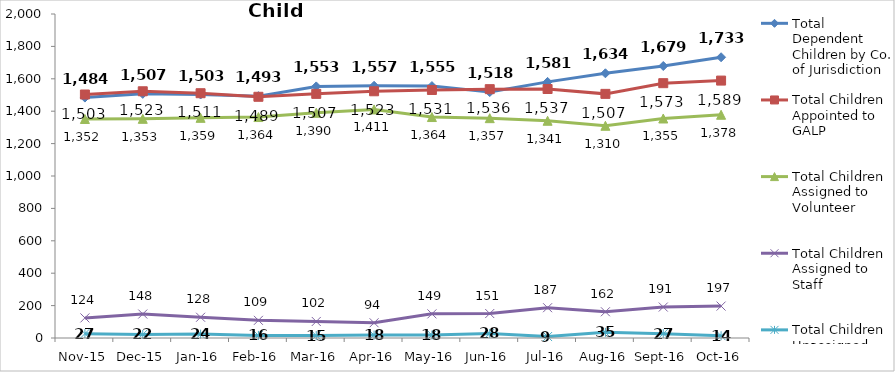
| Category | Total Dependent Children by Co. of Jurisdiction | Total Children Appointed to GALP | Total Children Assigned to Volunteer | Total Children Assigned to Staff | Total Children Unassigned |
|---|---|---|---|---|---|
| Nov-15 | 1484 | 1503 | 1352 | 124 | 27 |
| Dec-15 | 1507 | 1523 | 1353 | 148 | 22 |
| Jan-16 | 1503 | 1511 | 1359 | 128 | 24 |
| Feb-16 | 1493 | 1489 | 1364 | 109 | 16 |
| Mar-16 | 1553 | 1507 | 1390 | 102 | 15 |
| Apr-16 | 1557 | 1523 | 1411 | 94 | 18 |
| May-16 | 1555 | 1531 | 1364 | 149 | 18 |
| Jun-16 | 1518 | 1536 | 1357 | 151 | 28 |
| Jul-16 | 1581 | 1537 | 1341 | 187 | 9 |
| Aug-16 | 1634 | 1507 | 1310 | 162 | 35 |
| Sep-16 | 1679 | 1573 | 1355 | 191 | 27 |
| Oct-16 | 1733 | 1589 | 1378 | 197 | 14 |